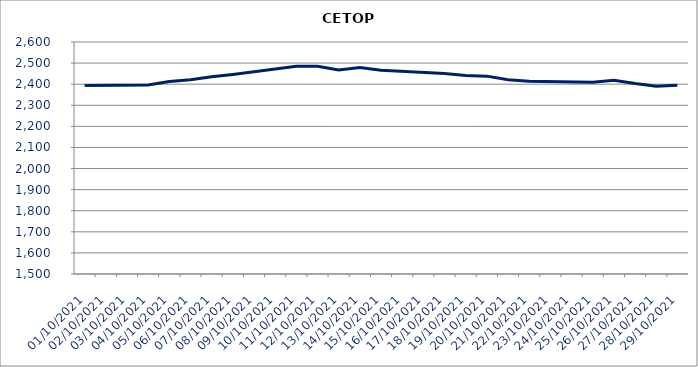
| Category | CETOP |
|---|---|
| 01/10/2021 | 2393.57 |
| 04/10/2021 | 2395.65 |
| 05/10/2021 | 2412.26 |
| 06/10/2021 | 2420.8 |
| 07/10/2021 | 2435.1 |
| 08/10/2021 | 2446.44 |
| 11/10/2021 | 2484.56 |
| 12/10/2021 | 2485.3 |
| 13/10/2021 | 2466.98 |
| 14/10/2021 | 2479.55 |
| 15/10/2021 | 2465.98 |
| 18/10/2021 | 2451.12 |
| 19/10/2021 | 2440.7 |
| 20/10/2021 | 2438.13 |
| 21/10/2021 | 2420.78 |
| 22/10/2021 | 2413.74 |
| 25/10/2021 | 2409.22 |
| 26/10/2021 | 2418.34 |
| 27/10/2021 | 2403.14 |
| 28/10/2021 | 2390.55 |
| 29/10/2021 | 2394.99 |